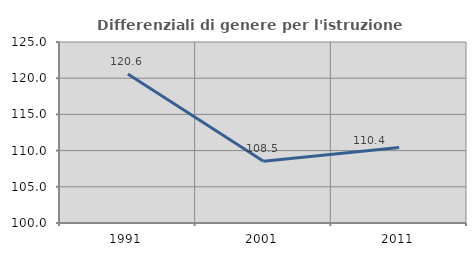
| Category | Differenziali di genere per l'istruzione superiore |
|---|---|
| 1991.0 | 120.57 |
| 2001.0 | 108.534 |
| 2011.0 | 110.428 |